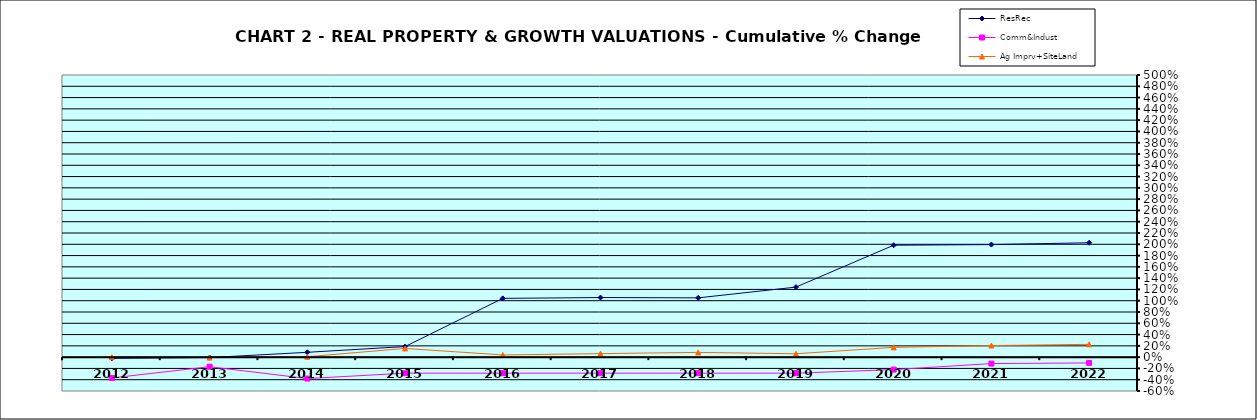
| Category | ResRec | Comm&Indust | Ag Imprv+SiteLand |
|---|---|---|---|
| 2012.0 | -0.021 | -0.369 | 0 |
| 2013.0 | -0.008 | -0.169 | -0.008 |
| 2014.0 | 0.086 | -0.379 | 0.008 |
| 2015.0 | 0.187 | -0.284 | 0.154 |
| 2016.0 | 1.042 | -0.284 | 0.039 |
| 2017.0 | 1.056 | -0.284 | 0.062 |
| 2018.0 | 1.051 | -0.284 | 0.084 |
| 2019.0 | 1.241 | -0.284 | 0.06 |
| 2020.0 | 1.984 | -0.221 | 0.173 |
| 2021.0 | 1.995 | -0.114 | 0.205 |
| 2022.0 | 2.027 | -0.102 | 0.227 |